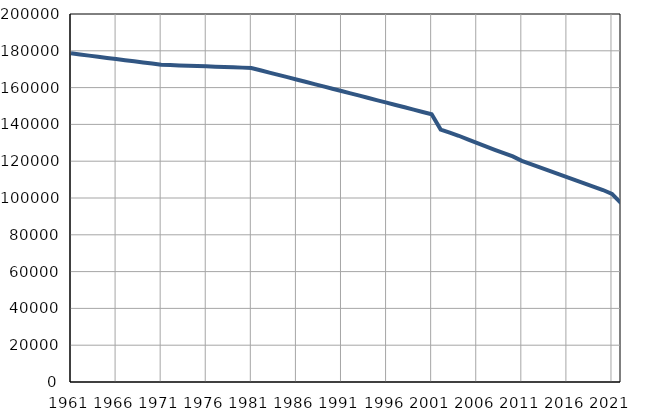
| Category | Population
size |
|---|---|
| 1961.0 | 178623 |
| 1962.0 | 178003 |
| 1963.0 | 177383 |
| 1964.0 | 176763 |
| 1965.0 | 176143 |
| 1966.0 | 175524 |
| 1967.0 | 174904 |
| 1968.0 | 174284 |
| 1969.0 | 173664 |
| 1970.0 | 173044 |
| 1971.0 | 172424 |
| 1972.0 | 172250 |
| 1973.0 | 172076 |
| 1974.0 | 171901 |
| 1975.0 | 171727 |
| 1976.0 | 171553 |
| 1977.0 | 171379 |
| 1978.0 | 171205 |
| 1979.0 | 171030 |
| 1980.0 | 170856 |
| 1981.0 | 170682 |
| 1982.0 | 169427 |
| 1983.0 | 168172 |
| 1984.0 | 166917 |
| 1985.0 | 165662 |
| 1986.0 | 164407 |
| 1987.0 | 163151 |
| 1988.0 | 161896 |
| 1989.0 | 160641 |
| 1990.0 | 159386 |
| 1991.0 | 158131 |
| 1992.0 | 156869 |
| 1993.0 | 155606 |
| 1994.0 | 154344 |
| 1995.0 | 153082 |
| 1996.0 | 151819 |
| 1997.0 | 150557 |
| 1998.0 | 149294 |
| 1999.0 | 148032 |
| 2000.0 | 146770 |
| 2001.0 | 145508 |
| 2002.0 | 137218 |
| 2003.0 | 135553 |
| 2004.0 | 133825 |
| 2005.0 | 131896 |
| 2006.0 | 129937 |
| 2007.0 | 128056 |
| 2008.0 | 126217 |
| 2009.0 | 124423 |
| 2010.0 | 122605 |
| 2011.0 | 120216 |
| 2012.0 | 118401 |
| 2013.0 | 116665 |
| 2014.0 | 114901 |
| 2015.0 | 113131 |
| 2016.0 | 111399 |
| 2017.0 | 109634 |
| 2018.0 | 107835 |
| 2019.0 | 106100 |
| 2020.0 | 104352 |
| 2021.0 | 102215 |
| 2022.0 | 97220 |